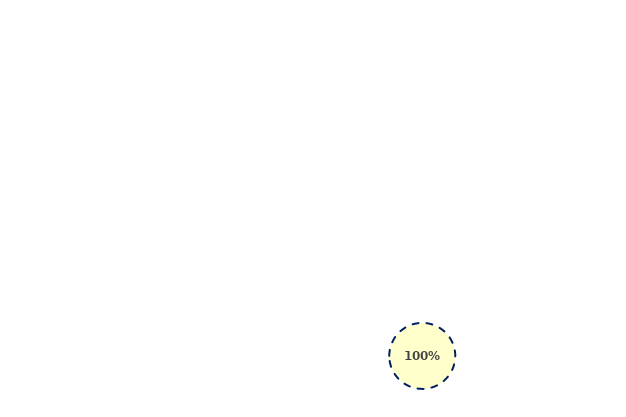
| Category | Y |
|---|---|
| 5.5 | 45 |
| 5.5 | 35 |
| 2.0 | 25 |
| 3.0 | 45 |
| 7.5 | 5 |
| 5.9 | 4.5 |
| 3.4 | 15 |
| 6.3 | 30 |
| 3.0 | 35 |
| 7.5 | 2 |